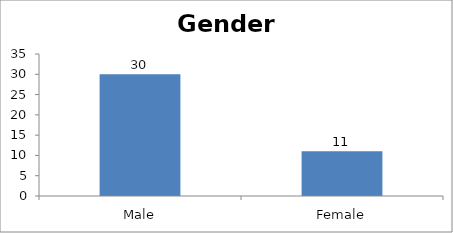
| Category | Gender |
|---|---|
| Male | 30 |
| Female | 11 |